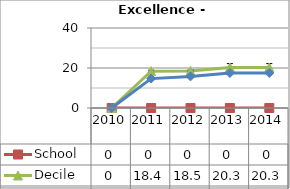
| Category | School  | Decile | National |
|---|---|---|---|
| 2010.0 | 0 | 0 | 0 |
| 2011.0 | 0 | 18.4 | 14.7 |
| 2012.0 | 0 | 18.5 | 15.8 |
| 2013.0 | 0 | 20.3 | 17.5 |
| 2014.0 | 0 | 20.3 | 17.5 |